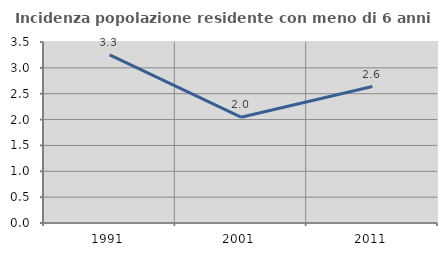
| Category | Incidenza popolazione residente con meno di 6 anni |
|---|---|
| 1991.0 | 3.252 |
| 2001.0 | 2.045 |
| 2011.0 | 2.638 |